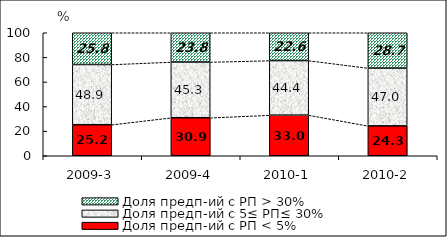
| Category | Доля предп-ий с РП < 5% | Доля предп-ий с 5≤ РП≤ 30% | Доля предп-ий с РП > 30% |
|---|---|---|---|
| 2009-3 | 25.241 | 48.948 | 25.811 |
| 2009-4 | 30.913 | 45.291 | 23.796 |
| 2010-1 | 33.005 | 44.359 | 22.636 |
| 2010-2 | 24.3 | 46.981 | 28.719 |